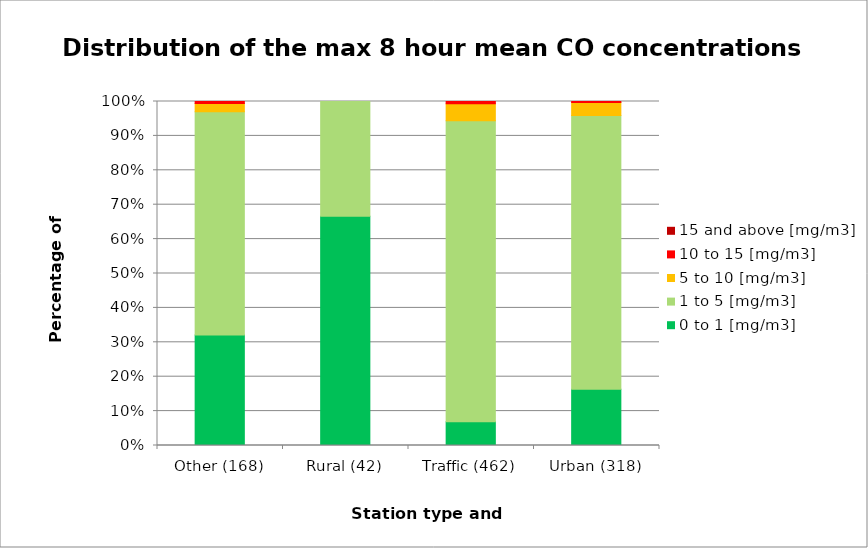
| Category | 0 to 1 [mg/m3] | 1 to 5 [mg/m3] | 5 to 10 [mg/m3] | 10 to 15 [mg/m3] | 15 and above [mg/m3] |
|---|---|---|---|---|---|
| Other (168) | 0.321 | 0.649 | 0.024 | 0.006 | 0 |
| Rural (42) | 0.667 | 0.333 | 0 | 0 | 0 |
| Traffic (462) | 0.069 | 0.874 | 0.05 | 0.006 | 0 |
| Urban (318) | 0.164 | 0.796 | 0.038 | 0.003 | 0 |